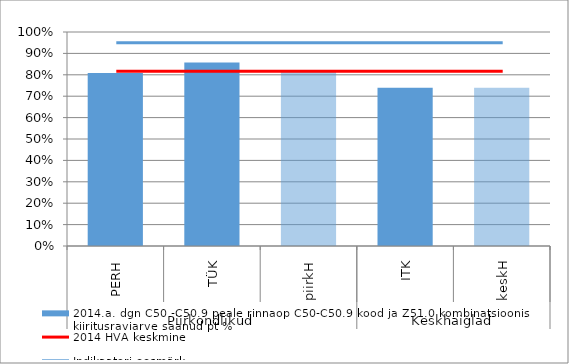
| Category | 2014.a. dgn C50 -C50.9 peale rinnaop C50-C50.9 kood ja Z51.0 kombinatsioonis kiiritusraviarve saanud pt % |
|---|---|
| 0 | 0.808 |
| 1 | 0.857 |
| 2 | 0.822 |
| 3 | 0.739 |
| 4 | 0.739 |